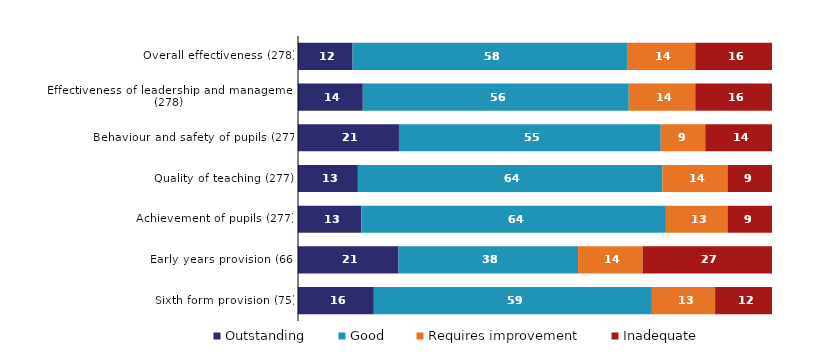
| Category | Outstanding | Good | Requires improvement | Inadequate |
|---|---|---|---|---|
| Overall effectiveness (278) | 11.511 | 57.914 | 14.388 | 16.187 |
| Effectiveness of leadership and management (278) | 13.669 | 56.115 | 14.029 | 16.187 |
| Behaviour and safety of pupils (277) | 21.3 | 55.235 | 9.386 | 14.079 |
| Quality of teaching (277) | 12.635 | 64.26 | 13.718 | 9.386 |
| Achievement of pupils (277) | 13.357 | 64.26 | 12.996 | 9.386 |
| Early years provision (66) | 21.212 | 37.879 | 13.636 | 27.273 |
| Sixth form provision (75) | 16 | 58.667 | 13.333 | 12 |